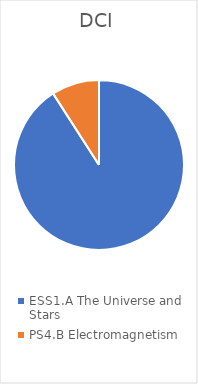
| Category | DCI |
|---|---|
| ESS1.A The Universe and Stars | 0.909 |
| PS4.B Electromagnetism | 0.091 |